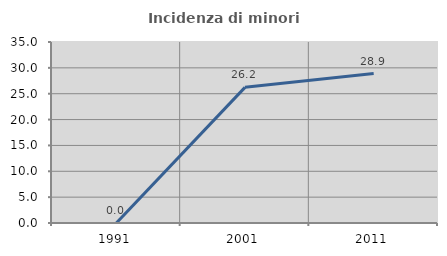
| Category | Incidenza di minori stranieri |
|---|---|
| 1991.0 | 0 |
| 2001.0 | 26.23 |
| 2011.0 | 28.889 |